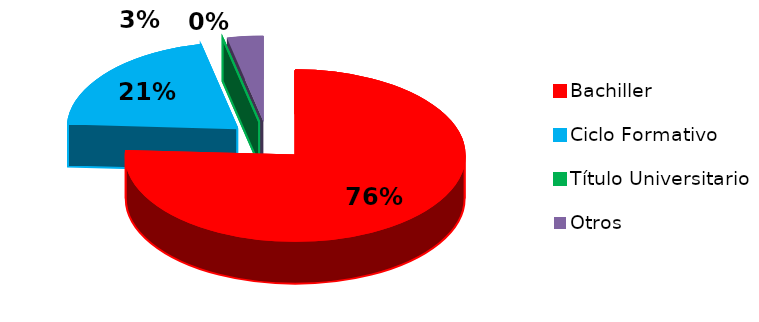
| Category | Series 0 |
|---|---|
| Bachiller | 44 |
| Ciclo Formativo | 12 |
| Título Universitario | 0 |
| Otros | 2 |